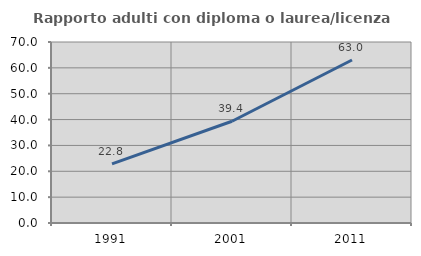
| Category | Rapporto adulti con diploma o laurea/licenza media  |
|---|---|
| 1991.0 | 22.836 |
| 2001.0 | 39.364 |
| 2011.0 | 63.033 |